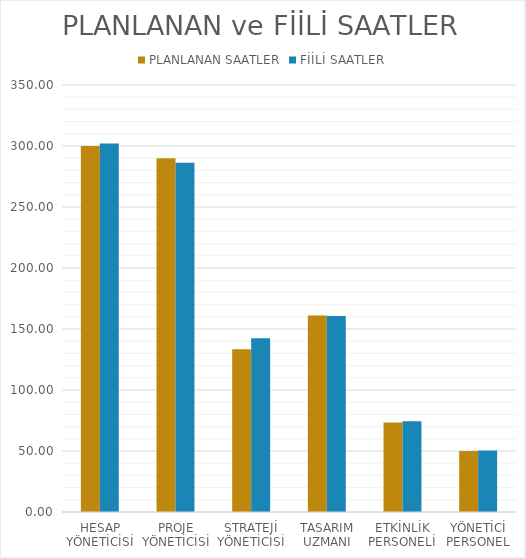
| Category | PLANLANAN SAATLER | FİİLİ SAATLER |
|---|---|---|
| HESAP YÖNETİCİSİ | 300 | 302 |
| PROJE YÖNETİCİSİ | 290 | 286.333 |
| STRATEJİ YÖNETİCİSİ | 133.333 | 142.5 |
| TASARIM UZMANI | 161.111 | 160.556 |
| ETKİNLİK PERSONELİ | 73.333 | 74.444 |
| YÖNETİCİ PERSONEL | 50 | 50.333 |